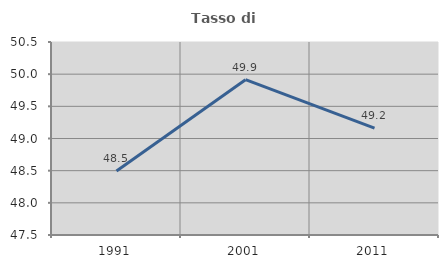
| Category | Tasso di occupazione   |
|---|---|
| 1991.0 | 48.496 |
| 2001.0 | 49.914 |
| 2011.0 | 49.161 |